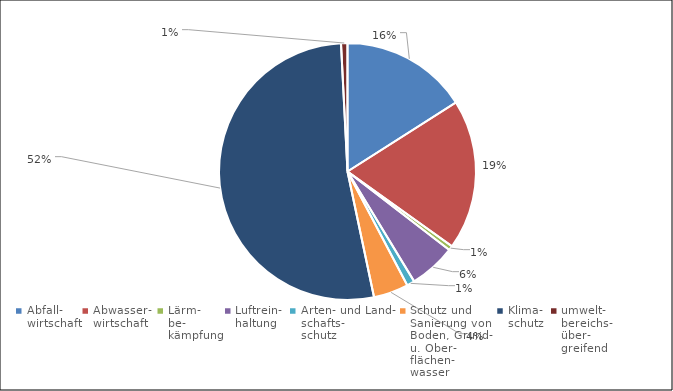
| Category | 2021 |
|---|---|
| Abfall-
wirtschaft | 294433.474 |
| Abwasser-
wirtschaft | 348462.891 |
| Lärm-
be-
kämpfung | 10349.856 |
| Luftrein-
haltung | 108184.824 |
| Arten- und Land-
schafts-
schutz | 18085.629 |
| Schutz und
Sanierung von
Boden, Grund-
u. Ober-
flächen-
wasser | 80747.146 |
| Klima-
schutz | 967487.376 |
| umwelt-
bereichs-
über-
greifend | 14892.291 |